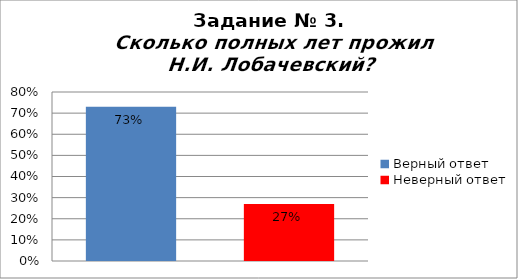
| Category | Сколько полных лет прожил Н.И. Лобачевский? |
|---|---|
| Верный ответ | 0.73 |
| Неверный ответ | 0.27 |